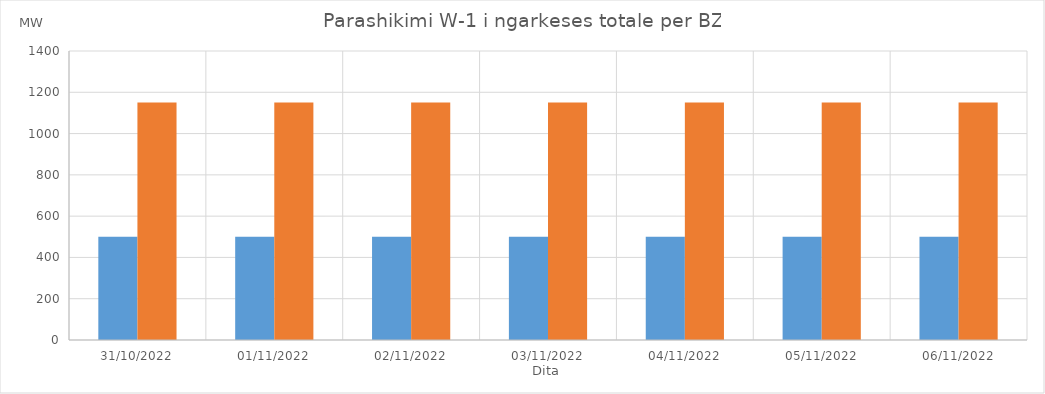
| Category | Min (MW) | Max (MW) |
|---|---|---|
| 31/10/2022 | 500 | 1150 |
| 01/11/2022 | 500 | 1150 |
| 02/11/2022 | 500 | 1150 |
| 03/11/2022 | 500 | 1150 |
| 04/11/2022 | 500 | 1150 |
| 05/11/2022 | 500 | 1150 |
| 06/11/2022 | 500 | 1150 |